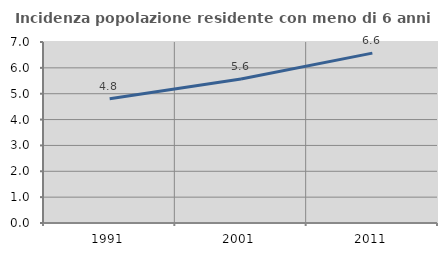
| Category | Incidenza popolazione residente con meno di 6 anni |
|---|---|
| 1991.0 | 4.802 |
| 2001.0 | 5.57 |
| 2011.0 | 6.57 |